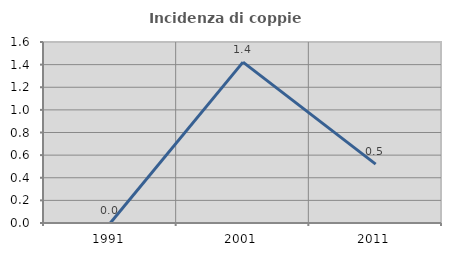
| Category | Incidenza di coppie miste |
|---|---|
| 1991.0 | 0 |
| 2001.0 | 1.422 |
| 2011.0 | 0.521 |